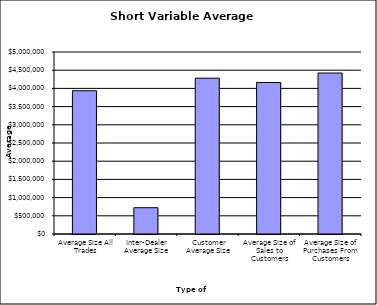
| Category | Security Type |
|---|---|
| Average Size All Trades | 3935870.549 |
| Inter-Dealer Average Size | 722142.039 |
| Customer Average Size | 4280467.178 |
| Average Size of Sales to Customers | 4162383.711 |
| Average Size of Purchases From Customers | 4422188.794 |